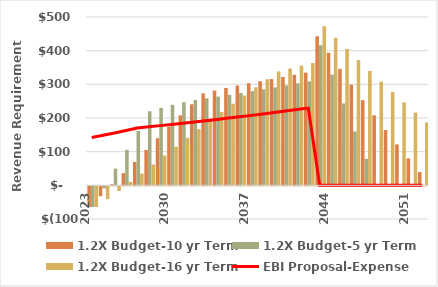
| Category | 1.2X Budget-10 yr Term | 1.2X Budget-5 yr Term | 1.2X Budget-16 yr Term |
|---|---|---|---|
| 2023.0 | -61.549 | -61.549 | -61.549 |
| 2024.0 | -29.267 | -6.041 | -37.977 |
| 2025.0 | 3.309 | 49.643 | -14.066 |
| 2026.0 | 36.195 | 105.516 | 10.2 |
| 2027.0 | 69.408 | 161.591 | 34.84 |
| 2028.0 | 104.922 | 219.84 | 61.828 |
| 2029.0 | 139.823 | 230.154 | 88.529 |
| 2030.0 | 174.098 | 239.193 | 114.938 |
| 2031.0 | 207.736 | 246.932 | 141.047 |
| 2032.0 | 240.722 | 253.348 | 166.851 |
| 2033.0 | 273.045 | 258.415 | 192.343 |
| 2034.0 | 281.465 | 263.583 | 217.519 |
| 2035.0 | 289.312 | 268.855 | 242.371 |
| 2036.0 | 296.576 | 274.232 | 266.893 |
| 2037.0 | 303.246 | 279.716 | 291.077 |
| 2038.0 | 309.311 | 285.311 | 314.919 |
| 2039.0 | 315.497 | 291.017 | 338.41 |
| 2040.0 | 321.807 | 296.837 | 347.027 |
| 2041.0 | 328.243 | 302.774 | 355.354 |
| 2042.0 | 334.808 | 308.83 | 363.385 |
| 2043.0 | 442.756 | 416.258 | 472.366 |
| 2044.0 | 393.834 | 328.598 | 438.364 |
| 2045.0 | 345.891 | 243.099 | 404.906 |
| 2046.0 | 298.945 | 159.803 | 372.001 |
| 2047.0 | 253.018 | 78.755 | 339.661 |
| 2048.0 | 208.129 | 0 | 307.898 |
| 2049.0 | 164.299 | 0 | 276.722 |
| 2050.0 | 121.549 | 0 | 246.146 |
| 2051.0 | 79.901 | 0 | 216.182 |
| 2052.0 | 39.378 | 0 | 186.841 |